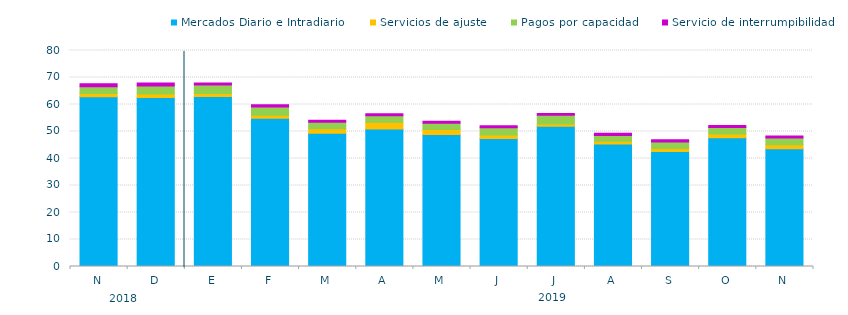
| Category | Mercados Diario e Intradiario  | Servicios de ajuste | Pagos por capacidad | Servicio de interrumpibilidad |
|---|---|---|---|---|
| N | 62.9 | 1.17 | 2.5 | 1.09 |
| D | 62.58 | 1.28 | 3.03 | 1.08 |
| E | 62.95 | 1.14 | 3.16 | 0.71 |
| F | 54.9 | 1.14 | 3.08 | 0.75 |
| M | 49.33 | 1.73 | 2.38 | 0.72 |
| A | 50.89 | 2.55 | 2.4 | 0.77 |
| M | 48.92 | 1.8 | 2.29 | 0.76 |
| J | 47.39 | 1.31 | 2.69 | 0.75 |
| J | 51.96 | 0.81 | 3.25 | 0.69 |
| A | 45.37 | 1.02 | 2.17 | 0.75 |
| S | 42.58 | 1.09 | 2.43 | 0.8 |
| O | 47.72 | 1.38 | 2.37 | 0.79 |
| N | 43.57 | 1.49 | 2.49 | 0.77 |